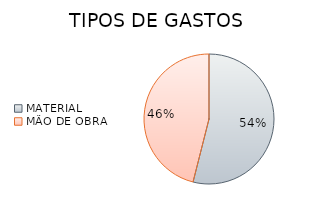
| Category | Series 0 |
|---|---|
| MATERIAL | 1435 |
| MÃO DE OBRA | 1225 |